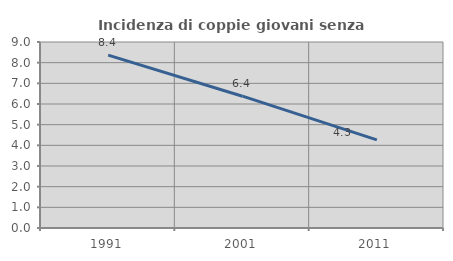
| Category | Incidenza di coppie giovani senza figli |
|---|---|
| 1991.0 | 8.362 |
| 2001.0 | 6.378 |
| 2011.0 | 4.267 |